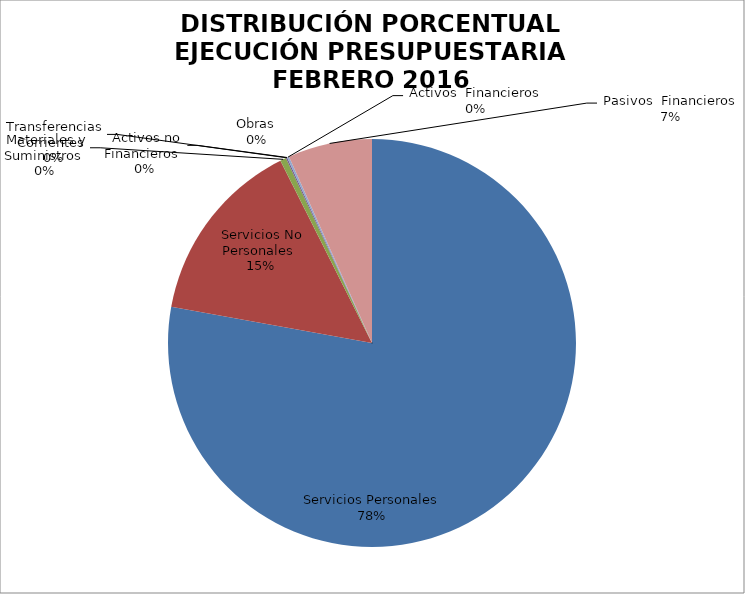
| Category | Series 0 | Series 1 |
|---|---|---|
| Servicios Personales | 11372248.18 | 0.778 |
| Servicios No Personales | 2155727.14 | 0.148 |
| Materiales y Suministros | 69962.03 | 0.005 |
| Transferencias Corrientes | 15000 | 0.001 |
| Activos no Financieros | 0 | 0 |
| Obras | 0 | 0 |
| Activos  Financieros | 23600 | 0.002 |
| Pasivos  Financieros | 974145.45 | 0.067 |